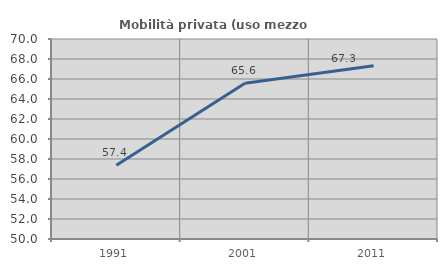
| Category | Mobilità privata (uso mezzo privato) |
|---|---|
| 1991.0 | 57.383 |
| 2001.0 | 65.568 |
| 2011.0 | 67.323 |